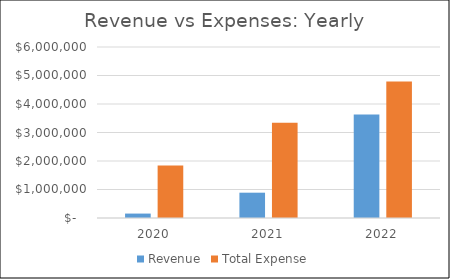
| Category | Revenue | Total Expense |
|---|---|---|
| 2020.0 | 155254.308 | 1844079.679 |
| 2021.0 | 888174.255 | 3343922.905 |
| 2022.0 | 3627383.044 | 4792395.57 |